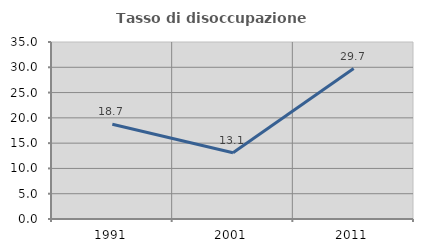
| Category | Tasso di disoccupazione giovanile  |
|---|---|
| 1991.0 | 18.746 |
| 2001.0 | 13.104 |
| 2011.0 | 29.745 |